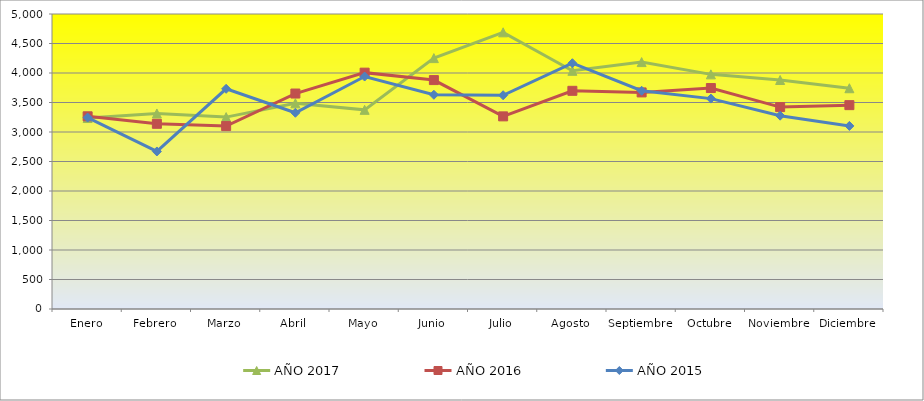
| Category | AÑO 2017 | AÑO 2016 | AÑO 2015 |
|---|---|---|---|
| Enero | 3236.923 | 3266 | 3245 |
| Febrero | 3313.846 | 3139 | 2670 |
| Marzo | 3252.308 | 3100 | 3732 |
| Abril | 3486.154 | 3652 | 3326 |
| Mayo | 3375.385 | 4006 | 3940 |
| Junio | 4252.308 | 3880 | 3631 |
| Julio | 4689.231 | 3265 | 3623 |
| Agosto | 4036.923 | 3698 | 4166 |
| Septiembre | 4184.615 | 3671 | 3699 |
| Octubre | 3976.915 | 3745 | 3566 |
| Noviembre | 3881.393 | 3422 | 3277 |
| Diciembre | 3741.538 | 3455 | 3103 |